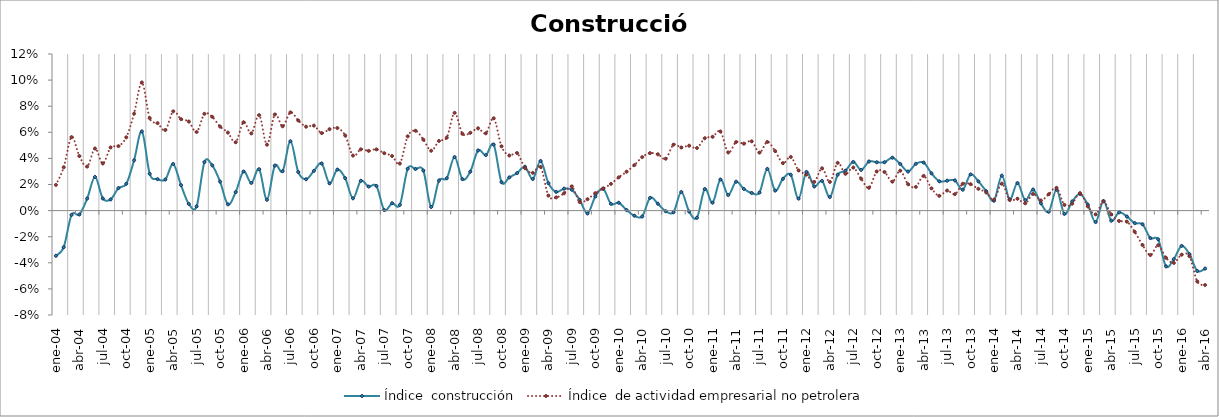
| Category | Índice  construcción | Índice  de actividad empresarial no petrolera |
|---|---|---|
| 2004-01-01 | -0.035 | 0.02 |
| 2004-02-01 | -0.028 | 0.033 |
| 2004-03-01 | -0.003 | 0.056 |
| 2004-04-01 | -0.003 | 0.042 |
| 2004-05-01 | 0.009 | 0.034 |
| 2004-06-01 | 0.026 | 0.048 |
| 2004-07-01 | 0.009 | 0.036 |
| 2004-08-01 | 0.009 | 0.048 |
| 2004-09-01 | 0.017 | 0.049 |
| 2004-10-01 | 0.021 | 0.056 |
| 2004-11-01 | 0.039 | 0.074 |
| 2004-12-01 | 0.061 | 0.098 |
| 2005-01-01 | 0.028 | 0.071 |
| 2005-02-01 | 0.024 | 0.067 |
| 2005-03-01 | 0.024 | 0.062 |
| 2005-04-01 | 0.036 | 0.076 |
| 2005-05-01 | 0.02 | 0.07 |
| 2005-06-01 | 0.005 | 0.068 |
| 2005-07-01 | 0.003 | 0.06 |
| 2005-08-01 | 0.037 | 0.074 |
| 2005-09-01 | 0.035 | 0.072 |
| 2005-10-01 | 0.022 | 0.064 |
| 2005-11-01 | 0.005 | 0.06 |
| 2005-12-01 | 0.014 | 0.052 |
| 2006-01-01 | 0.03 | 0.068 |
| 2006-02-01 | 0.021 | 0.059 |
| 2006-03-01 | 0.032 | 0.073 |
| 2006-04-01 | 0.008 | 0.051 |
| 2006-05-01 | 0.034 | 0.074 |
| 2006-06-01 | 0.03 | 0.065 |
| 2006-07-01 | 0.053 | 0.075 |
| 2006-08-01 | 0.03 | 0.069 |
| 2006-09-01 | 0.024 | 0.064 |
| 2006-10-01 | 0.03 | 0.065 |
| 2006-11-01 | 0.036 | 0.059 |
| 2006-12-01 | 0.021 | 0.062 |
| 2007-01-01 | 0.031 | 0.063 |
| 2007-02-01 | 0.025 | 0.058 |
| 2007-03-01 | 0.009 | 0.042 |
| 2007-04-01 | 0.023 | 0.047 |
| 2007-05-01 | 0.018 | 0.046 |
| 2007-06-01 | 0.019 | 0.047 |
| 2007-07-01 | 0 | 0.044 |
| 2007-08-01 | 0.006 | 0.042 |
| 2007-09-01 | 0.004 | 0.036 |
| 2007-10-01 | 0.032 | 0.057 |
| 2007-11-01 | 0.032 | 0.061 |
| 2007-12-01 | 0.031 | 0.054 |
| 2008-01-01 | 0.003 | 0.046 |
| 2008-02-01 | 0.023 | 0.053 |
| 2008-03-01 | 0.025 | 0.056 |
| 2008-04-01 | 0.041 | 0.075 |
| 2008-05-01 | 0.024 | 0.059 |
| 2008-06-01 | 0.03 | 0.06 |
| 2008-07-01 | 0.046 | 0.063 |
| 2008-08-01 | 0.043 | 0.059 |
| 2008-09-01 | 0.051 | 0.071 |
| 2008-10-01 | 0.022 | 0.049 |
| 2008-11-01 | 0.025 | 0.042 |
| 2008-12-01 | 0.029 | 0.044 |
| 2009-01-01 | 0.034 | 0.033 |
| 2009-02-01 | 0.024 | 0.029 |
| 2009-03-01 | 0.038 | 0.033 |
| 2009-04-01 | 0.021 | 0.012 |
| 2009-05-01 | 0.014 | 0.01 |
| 2009-06-01 | 0.017 | 0.013 |
| 2009-07-01 | 0.016 | 0.019 |
| 2009-08-01 | 0.008 | 0.006 |
| 2009-09-01 | -0.002 | 0.009 |
| 2009-10-01 | 0.011 | 0.013 |
| 2009-11-01 | 0.017 | 0.017 |
| 2009-12-01 | 0.005 | 0.02 |
| 2010-01-01 | 0.006 | 0.026 |
| 2010-02-01 | 0 | 0.03 |
| 2010-03-01 | -0.004 | 0.035 |
| 2010-04-01 | -0.004 | 0.041 |
| 2010-05-01 | 0.01 | 0.044 |
| 2010-06-01 | 0.005 | 0.043 |
| 2010-07-01 | 0 | 0.04 |
| 2010-08-01 | -0.001 | 0.051 |
| 2010-09-01 | 0.014 | 0.048 |
| 2010-10-01 | -0.001 | 0.05 |
| 2010-11-01 | -0.005 | 0.048 |
| 2010-12-01 | 0.017 | 0.055 |
| 2011-01-01 | 0.006 | 0.057 |
| 2011-02-01 | 0.024 | 0.061 |
| 2011-03-01 | 0.012 | 0.045 |
| 2011-04-01 | 0.022 | 0.053 |
| 2011-05-01 | 0.017 | 0.051 |
| 2011-06-01 | 0.014 | 0.053 |
| 2011-07-01 | 0.014 | 0.044 |
| 2011-08-01 | 0.032 | 0.053 |
| 2011-09-01 | 0.015 | 0.046 |
| 2011-10-01 | 0.024 | 0.036 |
| 2011-11-01 | 0.027 | 0.041 |
| 2011-12-01 | 0.009 | 0.031 |
| 2012-01-01 | 0.03 | 0.028 |
| 2012-02-01 | 0.018 | 0.022 |
| 2012-03-01 | 0.023 | 0.032 |
| 2012-04-01 | 0.01 | 0.022 |
| 2012-05-01 | 0.027 | 0.037 |
| 2012-06-01 | 0.031 | 0.028 |
| 2012-07-01 | 0.037 | 0.033 |
| 2012-08-01 | 0.031 | 0.024 |
| 2012-09-01 | 0.038 | 0.018 |
| 2012-10-01 | 0.037 | 0.03 |
| 2012-11-01 | 0.037 | 0.03 |
| 2012-12-01 | 0.041 | 0.022 |
| 2013-01-01 | 0.036 | 0.031 |
| 2013-02-01 | 0.03 | 0.02 |
| 2013-03-01 | 0.036 | 0.018 |
| 2013-04-01 | 0.037 | 0.027 |
| 2013-05-01 | 0.029 | 0.017 |
| 2013-06-01 | 0.022 | 0.011 |
| 2013-07-01 | 0.023 | 0.015 |
| 2013-08-01 | 0.023 | 0.013 |
| 2013-09-01 | 0.016 | 0.021 |
| 2013-10-01 | 0.028 | 0.02 |
| 2013-11-01 | 0.022 | 0.017 |
| 2013-12-01 | 0.015 | 0.014 |
| 2014-01-01 | 0.008 | 0.008 |
| 2014-02-01 | 0.027 | 0.021 |
| 2014-03-01 | 0.009 | 0.008 |
| 2014-04-01 | 0.021 | 0.009 |
| 2014-05-01 | 0.008 | 0.006 |
| 2014-06-01 | 0.016 | 0.013 |
| 2014-07-01 | 0.006 | 0.008 |
| 2014-08-01 | -0.001 | 0.013 |
| 2014-09-01 | 0.016 | 0.017 |
| 2014-10-01 | -0.003 | 0.004 |
| 2014-11-01 | 0.007 | 0.005 |
| 2014-12-01 | 0.013 | 0.013 |
| 2015-01-01 | 0.005 | 0.003 |
| 2015-02-01 | -0.009 | -0.003 |
| 2015-03-01 | 0.007 | 0.007 |
| 2015-04-01 | -0.008 | -0.003 |
| 2015-05-01 | -0.001 | -0.008 |
| 2015-06-01 | -0.005 | -0.008 |
| 2015-07-01 | -0.01 | -0.016 |
| 2015-08-01 | -0.01 | -0.026 |
| 2015-09-01 | -0.021 | -0.034 |
| 2015-10-01 | -0.022 | -0.027 |
| 2015-11-01 | -0.043 | -0.036 |
| 2015-12-01 | -0.037 | -0.04 |
| 2016-01-01 | -0.027 | -0.034 |
| 2016-02-01 | -0.033 | -0.035 |
| 2016-03-01 | -0.046 | -0.054 |
| 2016-04-01 | -0.044 | -0.057 |